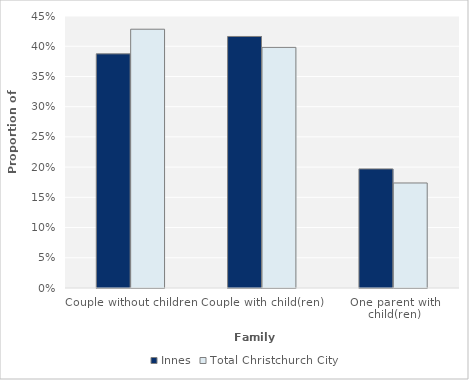
| Category | Innes | Total Christchurch City |
|---|---|---|
| Couple without children | 0.387 | 0.428 |
| Couple with child(ren) | 0.416 | 0.398 |
| One parent with child(ren) | 0.197 | 0.174 |